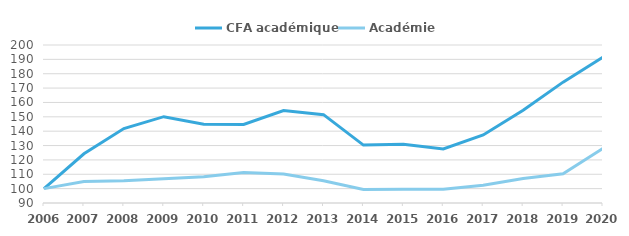
| Category | CFA académique | Académie |
|---|---|---|
| 2006 | 100 | 100 |
| 2007 | 124.242 | 105.015 |
| 2008 | 141.818 | 105.414 |
| 2009 | 150.101 | 106.82 |
| 2010 | 144.848 | 108.29 |
| 2011 | 144.646 | 111.242 |
| 2012 | 154.343 | 110.17 |
| 2013 | 151.515 | 105.473 |
| 2014 | 130.303 | 99.424 |
| 2015 | 130.909 | 99.618 |
| 2016 | 127.677 | 99.564 |
| 2017 | 137.374 | 102.386 |
| 2018 | 154.545 | 107.084 |
| 2019 | 174.141 | 110.337 |
| 2020 | 191.515 | 127.973 |